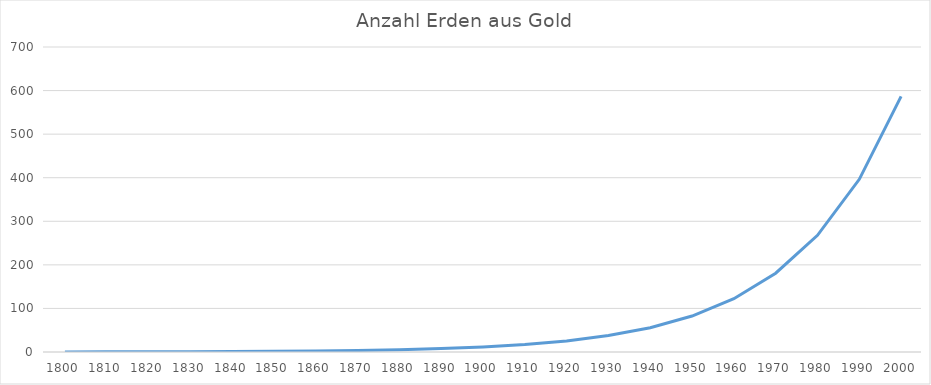
| Category | Anzahl Erden aus Gold |
|---|---|
| 1800.0 | 0.23 |
| 1810.0 | 0.34 |
| 1820.0 | 0.504 |
| 1830.0 | 0.746 |
| 1840.0 | 1.104 |
| 1850.0 | 1.634 |
| 1860.0 | 2.419 |
| 1870.0 | 3.581 |
| 1880.0 | 5.301 |
| 1890.0 | 7.847 |
| 1900.0 | 11.616 |
| 1910.0 | 17.194 |
| 1920.0 | 25.452 |
| 1930.0 | 37.675 |
| 1940.0 | 55.768 |
| 1950.0 | 82.55 |
| 1960.0 | 122.194 |
| 1970.0 | 180.877 |
| 1980.0 | 267.743 |
| 1990.0 | 396.324 |
| 2000.0 | 586.657 |